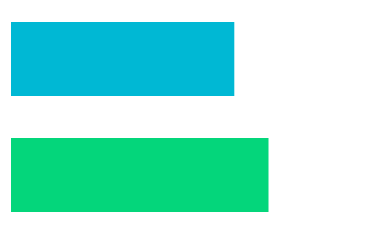
| Category |  INCOME | EXPENSES |
|---|---|---|
| 0 | 1500 | 1300 |